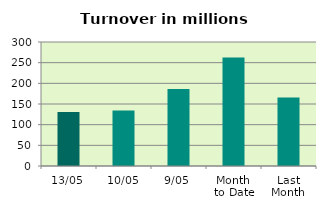
| Category | Series 0 |
|---|---|
| 13/05 | 130.565 |
| 10/05 | 134.448 |
| 9/05 | 186.185 |
| Month 
to Date | 262.198 |
| Last
Month | 165.638 |